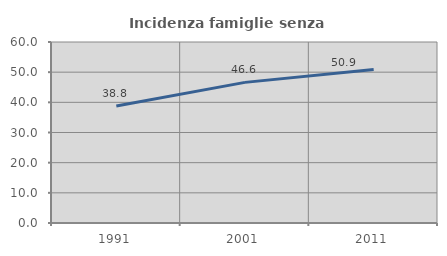
| Category | Incidenza famiglie senza nuclei |
|---|---|
| 1991.0 | 38.809 |
| 2001.0 | 46.618 |
| 2011.0 | 50.884 |